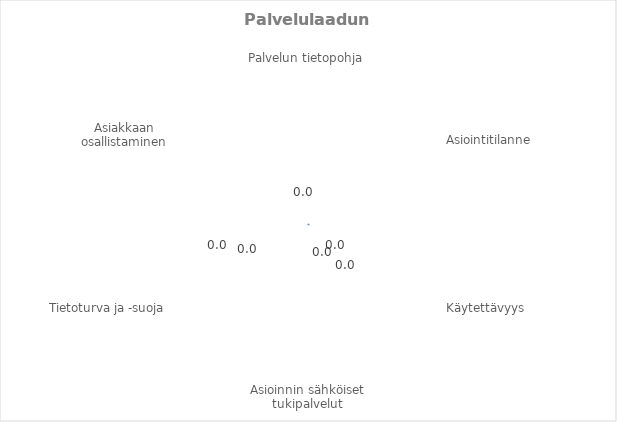
| Category | Series 0 |
|---|---|
| Palvelun tietopohja | 0 |
| Asiointitilanne | 0 |
| Käytettävyys | 0 |
| Asioinnin sähköiset tukipalvelut | 0 |
| Tietoturva ja -suoja | 0 |
| Asiakkaan osallistaminen | 0 |